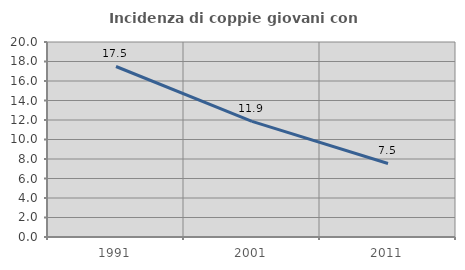
| Category | Incidenza di coppie giovani con figli |
|---|---|
| 1991.0 | 17.488 |
| 2001.0 | 11.864 |
| 2011.0 | 7.543 |